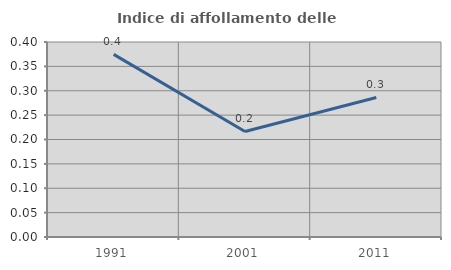
| Category | Indice di affollamento delle abitazioni  |
|---|---|
| 1991.0 | 0.375 |
| 2001.0 | 0.216 |
| 2011.0 | 0.286 |